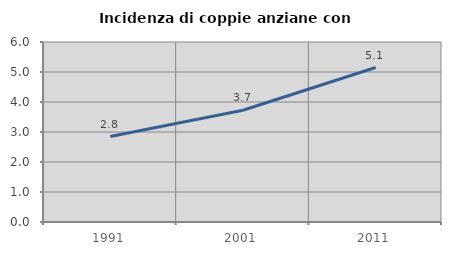
| Category | Incidenza di coppie anziane con figli |
|---|---|
| 1991.0 | 2.849 |
| 2001.0 | 3.723 |
| 2011.0 | 5.149 |